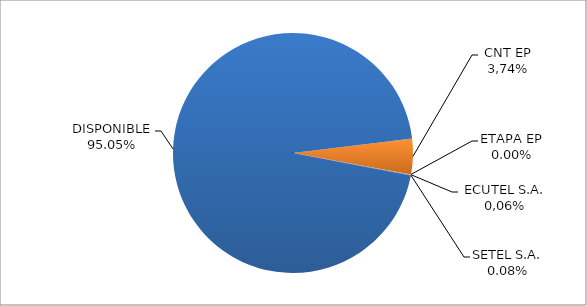
| Category | CODIGO DE AREA 6 |
|---|---|
| CORPORACIÓN NACIONAL TELECOMUNICACIONES CNT EP | 0.048 |
| ETAPA EP | 0 |
| CONECEL S.A. (ECUADORTELECOM S.A.) | 0.001 |
| SETEL S.A. | 0.001 |
| DISPONIBLE | 0.95 |